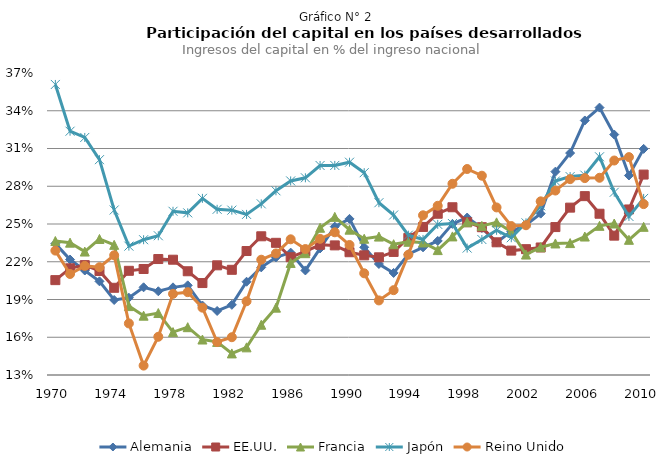
| Category | Alemania | EE.UU. | Francia | Japón | Reino Unido |
|---|---|---|---|---|---|
| 1970.0 | 0.234 | 0.205 | 0.236 | 0.361 | 0.229 |
| 1971.0 | 0.222 | 0.215 | 0.235 | 0.324 | 0.21 |
| 1972.0 | 0.213 | 0.217 | 0.228 | 0.319 | 0.217 |
| 1973.0 | 0.204 | 0.213 | 0.238 | 0.301 | 0.216 |
| 1974.0 | 0.19 | 0.199 | 0.233 | 0.261 | 0.225 |
| 1975.0 | 0.191 | 0.213 | 0.185 | 0.232 | 0.171 |
| 1976.0 | 0.2 | 0.214 | 0.177 | 0.238 | 0.137 |
| 1977.0 | 0.197 | 0.222 | 0.179 | 0.241 | 0.16 |
| 1978.0 | 0.2 | 0.222 | 0.164 | 0.26 | 0.194 |
| 1979.0 | 0.201 | 0.212 | 0.168 | 0.259 | 0.196 |
| 1980.0 | 0.185 | 0.203 | 0.158 | 0.27 | 0.184 |
| 1981.0 | 0.181 | 0.217 | 0.156 | 0.262 | 0.156 |
| 1982.0 | 0.186 | 0.214 | 0.147 | 0.261 | 0.16 |
| 1983.0 | 0.204 | 0.229 | 0.152 | 0.258 | 0.189 |
| 1984.0 | 0.216 | 0.24 | 0.17 | 0.266 | 0.222 |
| 1985.0 | 0.223 | 0.235 | 0.184 | 0.276 | 0.227 |
| 1986.0 | 0.227 | 0.224 | 0.219 | 0.284 | 0.238 |
| 1987.0 | 0.213 | 0.228 | 0.227 | 0.287 | 0.23 |
| 1988.0 | 0.231 | 0.233 | 0.247 | 0.296 | 0.238 |
| 1989.0 | 0.248 | 0.233 | 0.256 | 0.297 | 0.243 |
| 1990.0 | 0.254 | 0.228 | 0.245 | 0.299 | 0.233 |
| 1991.0 | 0.232 | 0.225 | 0.238 | 0.291 | 0.211 |
| 1992.0 | 0.218 | 0.224 | 0.24 | 0.267 | 0.189 |
| 1993.0 | 0.211 | 0.228 | 0.234 | 0.257 | 0.197 |
| 1994.0 | 0.226 | 0.239 | 0.236 | 0.241 | 0.226 |
| 1995.0 | 0.231 | 0.248 | 0.235 | 0.238 | 0.257 |
| 1996.0 | 0.237 | 0.258 | 0.229 | 0.25 | 0.264 |
| 1997.0 | 0.25 | 0.263 | 0.24 | 0.25 | 0.282 |
| 1998.0 | 0.255 | 0.251 | 0.251 | 0.231 | 0.294 |
| 1999.0 | 0.247 | 0.247 | 0.249 | 0.238 | 0.288 |
| 2000.0 | 0.235 | 0.235 | 0.251 | 0.245 | 0.263 |
| 2001.0 | 0.244 | 0.229 | 0.244 | 0.239 | 0.248 |
| 2002.0 | 0.249 | 0.23 | 0.226 | 0.251 | 0.249 |
| 2003.0 | 0.258 | 0.231 | 0.232 | 0.264 | 0.268 |
| 2004.0 | 0.292 | 0.248 | 0.235 | 0.284 | 0.277 |
| 2005.0 | 0.306 | 0.263 | 0.235 | 0.288 | 0.286 |
| 2006.0 | 0.332 | 0.272 | 0.24 | 0.289 | 0.286 |
| 2007.0 | 0.343 | 0.258 | 0.249 | 0.303 | 0.287 |
| 2008.0 | 0.321 | 0.241 | 0.25 | 0.275 | 0.3 |
| 2009.0 | 0.289 | 0.262 | 0.237 | 0.256 | 0.303 |
| 2010.0 | 0.31 | 0.289 | 0.248 | 0.27 | 0.266 |